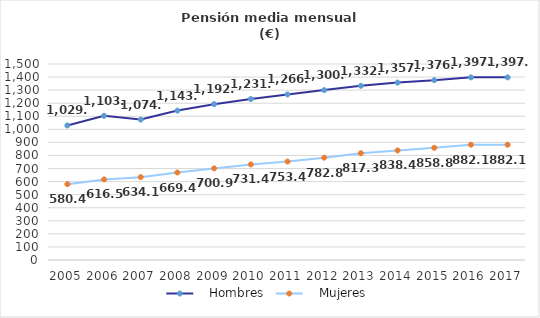
| Category |    Hombres |    Mujeres |
|---|---|---|
| 2005.0 | 1029.684 | 580.448 |
| 2006.0 | 1103.466 | 616.453 |
| 2007.0 | 1074.58 | 634.14 |
| 2008.0 | 1143.51 | 669.42 |
| 2009.0 | 1192.74 | 700.88 |
| 2010.0 | 1231.92 | 731.43 |
| 2011.0 | 1266.86 | 753.41 |
| 2012.0 | 1300.25 | 782.84 |
| 2013.0 | 1332.81 | 817.34 |
| 2014.0 | 1357.6 | 838.39 |
| 2015.0 | 1376.18 | 858.75 |
| 2016.0 | 1397.653 | 882.1 |
| 2017.0 | 1397.653 | 882.1 |